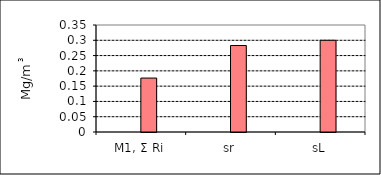
| Category | Series 1 | Series 0 | Series 5 | Series 6 |
|---|---|---|---|---|
| M1, Σ Ri |  |  | 0.176 |  |
| sr |  |  | 0.283 |  |
| sL |  |  | 0.3 |  |